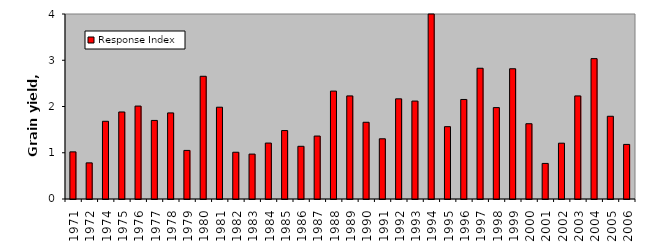
| Category | Response Index |
|---|---|
| 1971.0 | 1.019 |
| 1972.0 | 0.781 |
| 1974.0 | 1.68 |
| 1975.0 | 1.882 |
| 1976.0 | 2.009 |
| 1977.0 | 1.699 |
| 1978.0 | 1.861 |
| 1979.0 | 1.051 |
| 1980.0 | 2.653 |
| 1981.0 | 1.985 |
| 1982.0 | 1.011 |
| 1983.0 | 0.971 |
| 1984.0 | 1.209 |
| 1985.0 | 1.48 |
| 1986.0 | 1.139 |
| 1987.0 | 1.361 |
| 1988.0 | 2.333 |
| 1989.0 | 2.229 |
| 1990.0 | 1.659 |
| 1991.0 | 1.302 |
| 1992.0 | 2.166 |
| 1993.0 | 2.117 |
| 1994.0 | 4.085 |
| 1995.0 | 1.564 |
| 1996.0 | 2.152 |
| 1997.0 | 2.827 |
| 1998.0 | 1.976 |
| 1999.0 | 2.816 |
| 2000.0 | 1.628 |
| 2001.0 | 0.769 |
| 2002.0 | 1.207 |
| 2003.0 | 2.229 |
| 2004.0 | 3.035 |
| 2005.0 | 1.789 |
| 2006.0 | 1.18 |